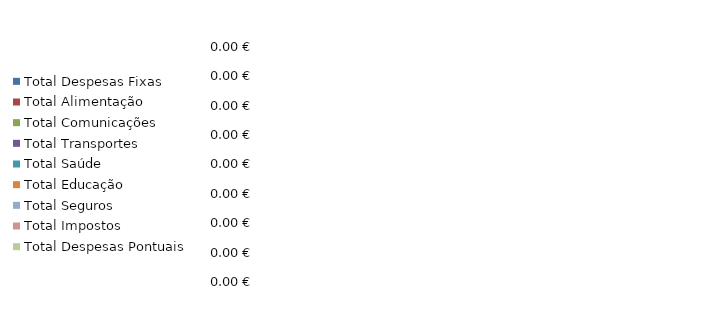
| Category | Total Despesas Pontuais | Total Impostos | Total Seguros | Total Educação | Total Saúde | Total Transportes | Total Comunicações | Total Alimentação | Total Despesas Fixas |
|---|---|---|---|---|---|---|---|---|---|
| 0 | 0 | 0 | 0 | 0 | 0 | 0 | 0 | 0 | 0 |